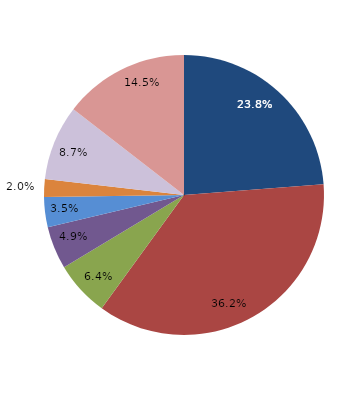
| Category | Series 0 |
|---|---|
| قبل الدخول
Before Consummation | 23.768 |
| -1 | 36.232 |
| 1 | 6.377 |
| 2 | 4.928 |
| 3 | 3.478 |
| 4 | 2.029 |
|  5 - 9 | 8.696 |
| 10+ | 14.493 |